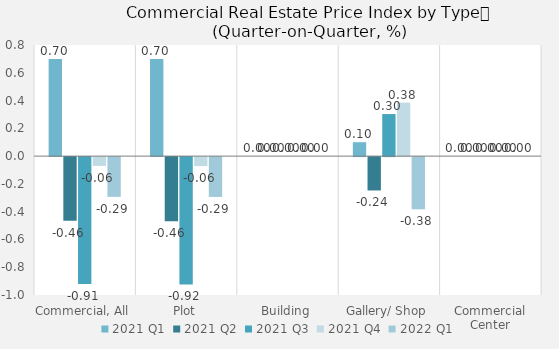
| Category | 2021 | 2022 |
|---|---|---|
| Commercial, All | -0.063 | -0.286 |
| Plot | -0.065 | -0.287 |
| Building | 0 | 0 |
| Gallery/ Shop | 0.385 | -0.376 |
| Commercial Center | 0 | 0 |